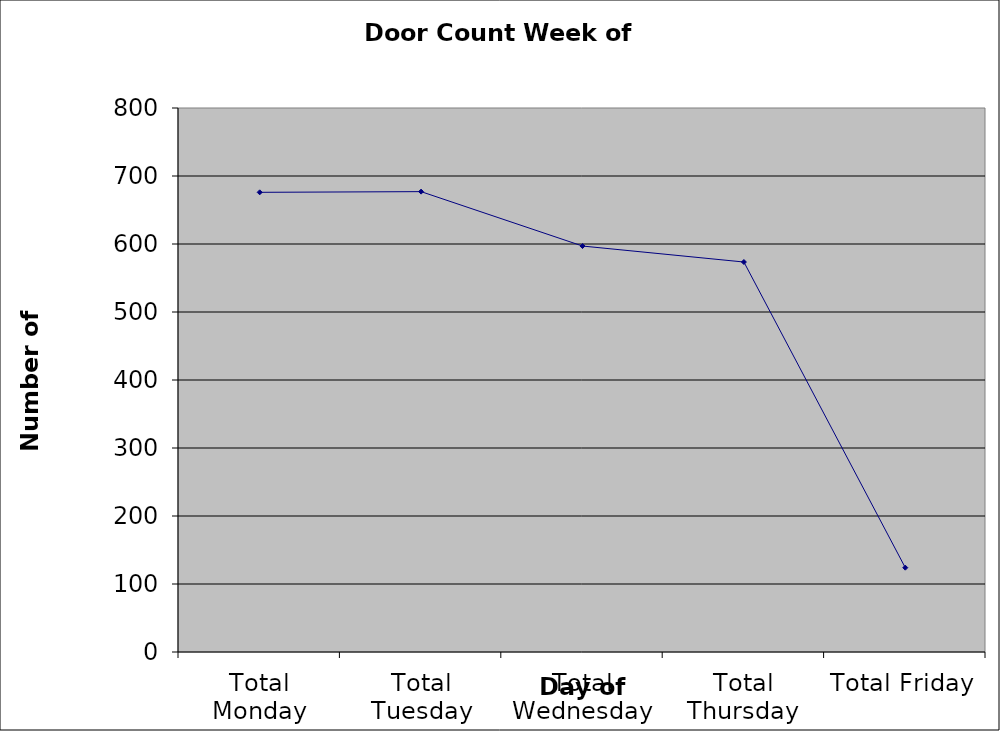
| Category | Series 0 |
|---|---|
| Total Monday | 676 |
| Total Tuesday | 677 |
| Total Wednesday | 597 |
| Total Thursday | 573.5 |
| Total Friday | 124 |